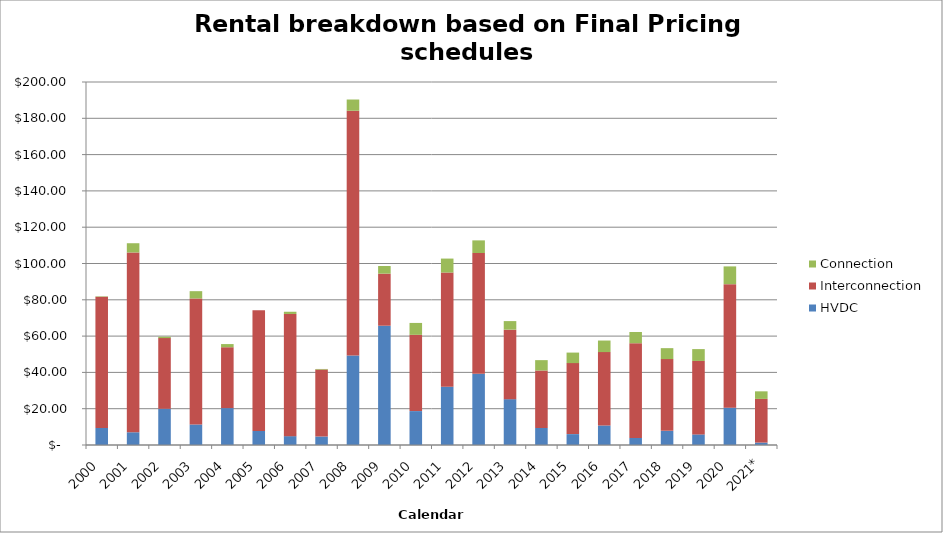
| Category | HVDC | Interconnection | Connection |
|---|---|---|---|
| 2000 | 9368742.678 | 72310211.304 | 241886.048 |
| 2001 | 7011741.415 | 99057022.354 | 5098769.146 |
| 2002 | 19938368.36 | 38950513.18 | 772405.05 |
| 2003 | 11300190.12 | 69429610.02 | 4025391.46 |
| 2004 | 20333873.57 | 33532220.2 | 1742494.83 |
| 2005 | 7738124.2 | 66543567.91 | -1197261.62 |
| 2006 | 4880973.02 | 67316670.81 | 1216612.6 |
| 2007 | 4675827.91 | 36876976.57 | 341772.08 |
| 2008 | 49368068.43 | 134792755.01 | 6188457.07 |
| 2009 | 65720374.034 | 28694916.835 | 4192400.588 |
| 2010 | 18674875.01 | 42030306.83 | 6548043.89 |
| 2011 | 32099396.42 | 62919840.73 | 7693844.84 |
| 2012 | 39321435.88 | 66447080.78 | 6975160.89 |
| 2013 | 25264153.84 | 38284233.3 | 4720246.72 |
| 2014 | 9369227.38 | 31671923.31 | 5716686.08 |
| 2015 | 5993367.71 | 39119609.36 | 5803859.03 |
| 2016 | 10758194.59 | 40429864.8 | 6366315.02 |
| 2017 | 3853191.28 | 52228017.1 | 6191896.05 |
| 2018 | 7796771.17 | 39525941.09 | 6037470.49 |
| 2019 | 5833523.27 | 40473784.86 | 6531858.63 |
| 2020 | 20552823.75 | 68060151.66 | 9789006.35 |
| 2021* | 1338521.82 | 24060309.64 | 4172828.4 |